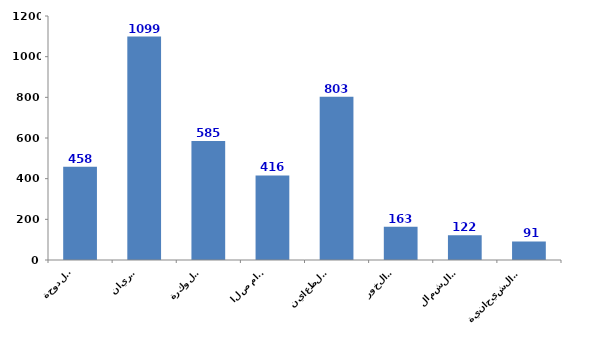
| Category | Series 0 |
|---|---|
| الدوحة
Doha | 458 |
| الريان
Rayyan | 1099 |
| الوكرة
Wakrah | 585 |
| ام صلال
Umm Slal | 416 |
| الظعاين
Al-Daayen | 803 |
| الخور
Al-Khor | 163 |
| الشمال
Al-Shamal | 122 |
| الشيحانية
Al-Shahhaniya  | 91 |